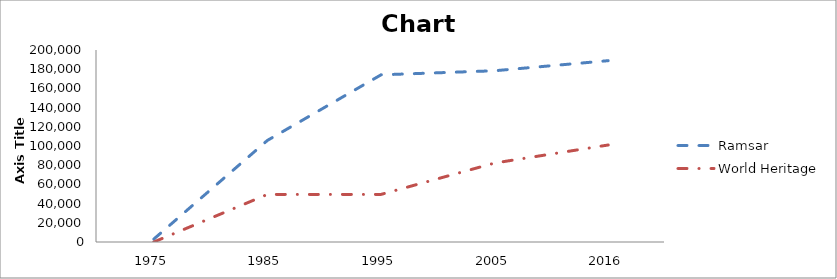
| Category | Ramsar | World Heritage |
|---|---|---|
| 1975.0 | 3037.57 | 0 |
| 1985.0 | 105816.89 | 49565.6 |
| 1995.0 | 174119.22 | 49565.6 |
| 2005.0 | 178384.93 | 82245.3 |
| 2016.0 | 188879.51 | 101051.51 |